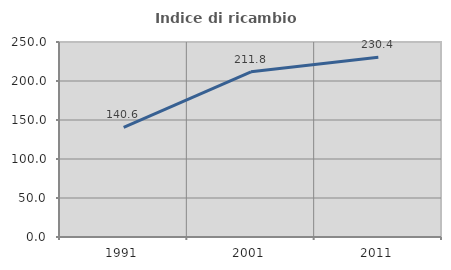
| Category | Indice di ricambio occupazionale  |
|---|---|
| 1991.0 | 140.625 |
| 2001.0 | 211.765 |
| 2011.0 | 230.435 |